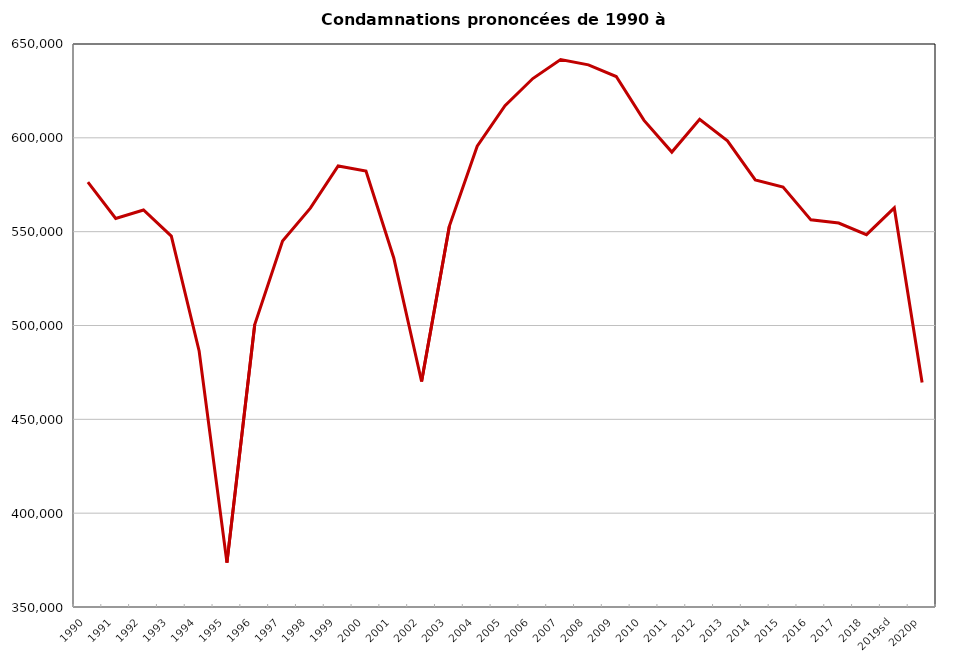
| Category | Condamnations |
|---|---|
| 1990 | 576364 |
| 1991 | 557055 |
| 1992 | 561543 |
| 1993 | 547610 |
| 1994 | 486444 |
| 1995 | 373660 |
| 1996 | 500536 |
| 1997 | 545046 |
| 1998 | 562511 |
| 1999 | 585032 |
| 2000 | 582249 |
| 2001 | 535990 |
| 2002 | 470180 |
| 2003 | 552962 |
| 2004 | 595525 |
| 2005 | 617103 |
| 2006 | 631590 |
| 2007 | 641678 |
| 2008 | 638871 |
| 2009 | 632674 |
| 2010 | 609277 |
| 2011 | 592402 |
| 2012 | 609844 |
| 2013 | 598353 |
| 2014 | 577586 |
| 2015 | 573746 |
| 2016 | 556296 |
| 2017 | 554619 |
| 2018 | 548411 |
| 2019sd | 562668 |
| 2020p | 469571 |